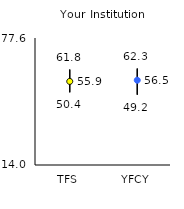
| Category | 25th | 75th | Mean |
|---|---|---|---|
| TFS | 50.4 | 61.8 | 55.86 |
| YFCY | 49.2 | 62.3 | 56.45 |